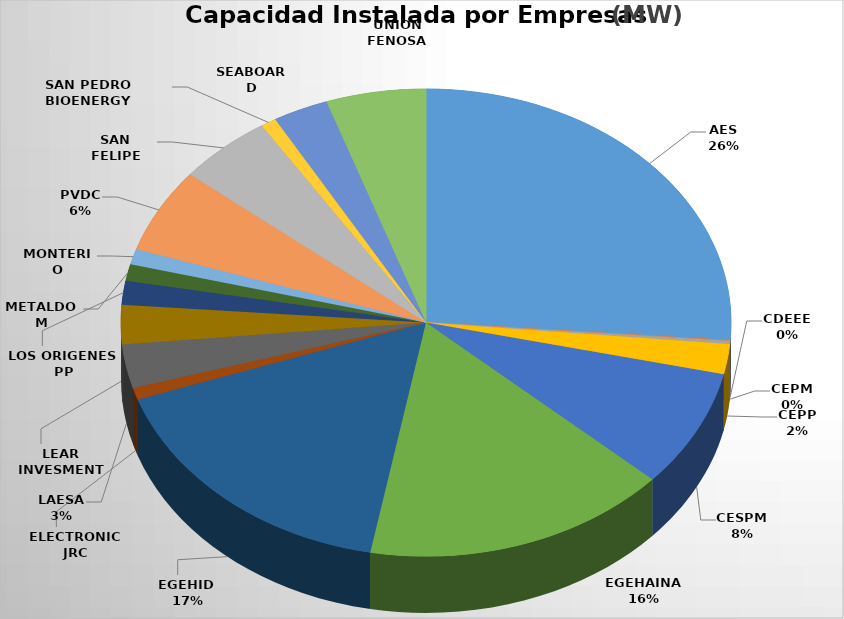
| Category | Potencia     (MW) | % |
|---|---|---|
| AES | 963 | 0.262 |
| CDEEE | 1.9 | 0.001 |
| CEPM | 8.25 | 0.002 |
| CEPP | 76.8 | 0.021 |
| CESPM | 300 | 0.082 |
| EGEHAINA  | 596.6 | 0.162 |
| EGEHID  | 615.72 | 0.167 |
| ELECTRONIC JRC | 30 | 0.008 |
| LAESA | 111.2 | 0.03 |
| LEAR INVESMENT | 100.1 | 0.027 |
| LOS ORIGENES PP | 60.69 | 0.017 |
| METALDOM | 42 | 0.011 |
| MONTERIO | 39.4 | 0.011 |
| PVDC | 215 | 0.058 |
| SAN FELIPE | 185 | 0.05 |
| SAN PEDRO BIOENERGY | 30 | 0.008 |
| SEABOARD | 108 | 0.029 |
| UNION FENOSA | 194.5 | 0.053 |